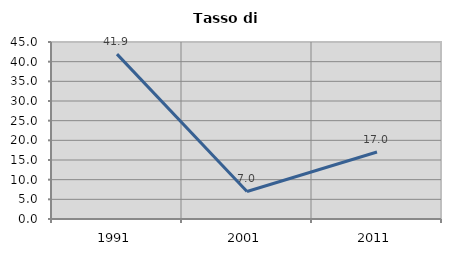
| Category | Tasso di disoccupazione   |
|---|---|
| 1991.0 | 41.911 |
| 2001.0 | 6.993 |
| 2011.0 | 17.045 |